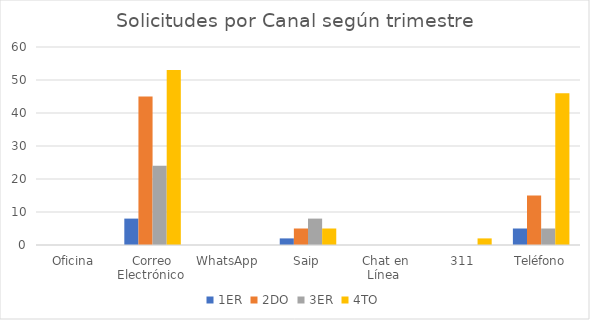
| Category | 1ER | 2DO | 3ER | 4TO |
|---|---|---|---|---|
| Oficina | 0 | 0 | 0 | 0 |
| Correo Electrónico  | 8 | 45 | 24 | 53 |
| WhatsApp  | 0 | 0 | 0 | 0 |
| Saip | 2 | 5 | 8 | 5 |
| Chat en Línea  | 0 | 0 | 0 | 0 |
| 311 | 0 | 0 | 0 | 2 |
| Teléfono | 5 | 15 | 5 | 46 |